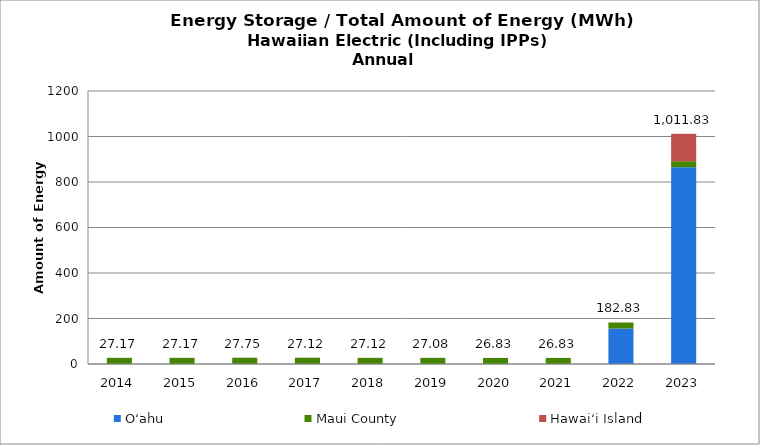
| Category | O‘ahu | Maui County | Hawai‘i Island |
|---|---|---|---|
| 2014.0 | 0.024 | 26.645 | 0.498 |
| 2015.0 | 0.024 | 26.645 | 0.498 |
| 2016.0 | 0.274 | 26.978 | 0.498 |
| 2017.0 | 0.274 | 26.978 | 0.498 |
| 2018.0 | 0.306 | 26.31 | 0.498 |
| 2019.0 | 0.274 | 26.31 | 0.498 |
| 2020.0 | 0.024 | 26.31 | 0.498 |
| 2021.0 | 0.024 | 26.31 | 0.498 |
| 2022.0 | 156.024 | 26.31 | 0.498 |
| 2023.0 | 865.024 | 26.31 | 120.498 |